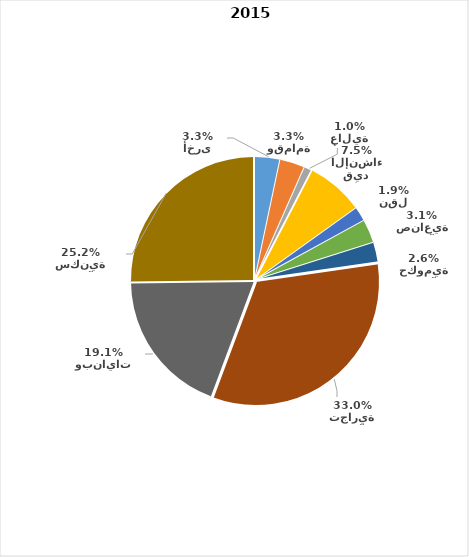
| Category | Series 0 |
|---|---|
| مواقع أخرى | 3.3 |
| نفايات وقمامة | 3.3 |
| أبراج عالية | 1 |
| مباني قيد الإنشاء | 7.5 |
| وسائل نقل | 1.9 |
| منشآت صناعية | 3.1 |
| منشآت حكومية | 2.6 |
| منشآت تجارية | 33 |
| شقق وبنايات | 19.1 |
| منشآت سكنية | 25.2 |